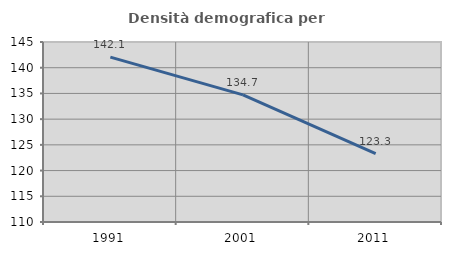
| Category | Densità demografica |
|---|---|
| 1991.0 | 142.059 |
| 2001.0 | 134.726 |
| 2011.0 | 123.296 |